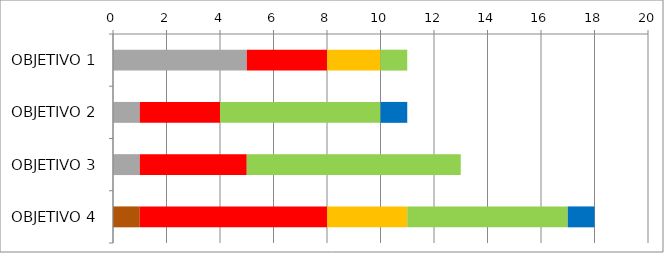
| Category | Series 0 | Series 1 | Series 2 | Series 3 | Series 4 | Series 5 |
|---|---|---|---|---|---|---|
| OBJETIVO 1 | 0 | 5 | 3 | 2 | 1 | 0 |
| OBJETIVO 2 | 0 | 1 | 3 | 0 | 6 | 1 |
| OBJETIVO 3 | 0 | 1 | 4 | 0 | 8 | 0 |
| OBJETIVO 4 | 1 | 0 | 7 | 3 | 6 | 1 |